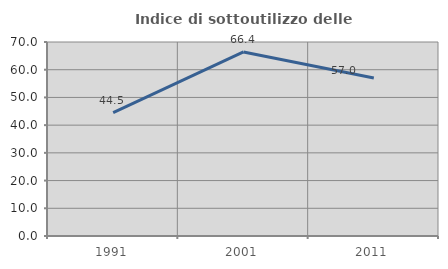
| Category | Indice di sottoutilizzo delle abitazioni  |
|---|---|
| 1991.0 | 44.538 |
| 2001.0 | 66.4 |
| 2011.0 | 57.025 |